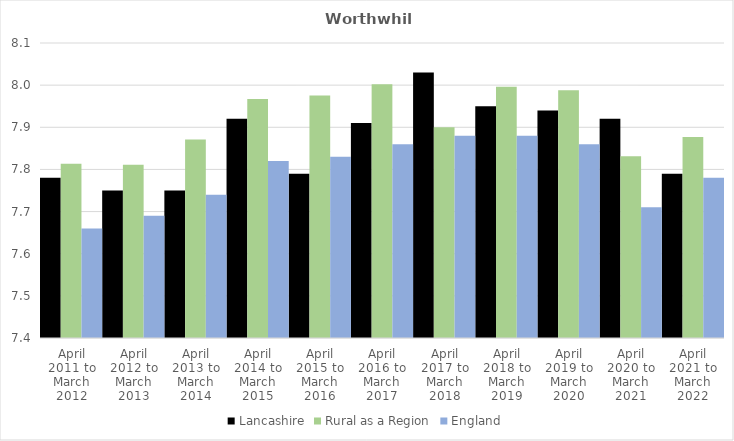
| Category | Lancashire | Rural as a Region | England |
|---|---|---|---|
| April 2011 to March 2012 | 7.78 | 7.813 | 7.66 |
| April 2012 to March 2013 | 7.75 | 7.811 | 7.69 |
| April 2013 to March 2014 | 7.75 | 7.871 | 7.74 |
| April 2014 to March 2015 | 7.92 | 7.967 | 7.82 |
| April 2015 to March 2016 | 7.79 | 7.975 | 7.83 |
| April 2016 to March 2017 | 7.91 | 8.002 | 7.86 |
| April 2017 to March 2018 | 8.03 | 7.9 | 7.88 |
| April 2018 to March 2019 | 7.95 | 7.996 | 7.88 |
| April 2019 to March 2020 | 7.94 | 7.988 | 7.86 |
| April 2020 to March 2021 | 7.92 | 7.831 | 7.71 |
| April 2021 to March 2022 | 7.79 | 7.877 | 7.78 |